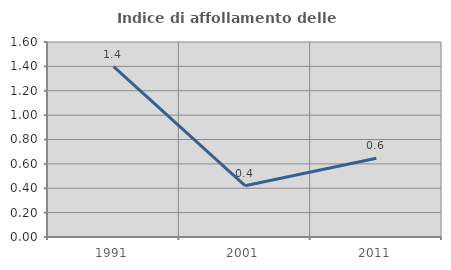
| Category | Indice di affollamento delle abitazioni  |
|---|---|
| 1991.0 | 1.398 |
| 2001.0 | 0.421 |
| 2011.0 | 0.646 |